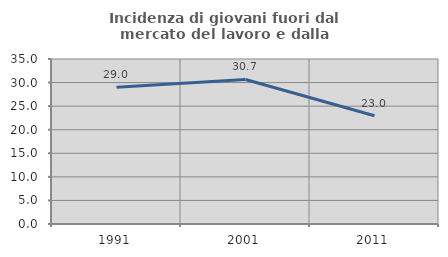
| Category | Incidenza di giovani fuori dal mercato del lavoro e dalla formazione  |
|---|---|
| 1991.0 | 29.007 |
| 2001.0 | 30.665 |
| 2011.0 | 22.962 |